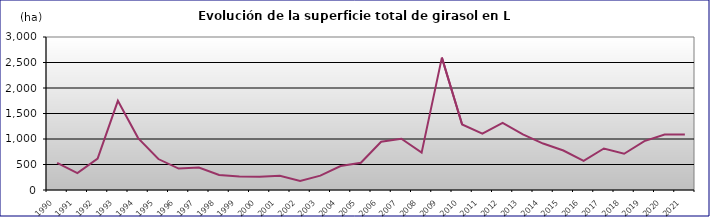
| Category | TOTAL |
|---|---|
| 1990.0 | 532 |
| 1991.0 | 332 |
| 1992.0 | 614 |
| 1993.0 | 1749 |
| 1994.0 | 1018 |
| 1995.0 | 607 |
| 1996.0 | 420 |
| 1997.0 | 440 |
| 1998.0 | 294 |
| 1999.0 | 263 |
| 2000.0 | 260 |
| 2001.0 | 279 |
| 2002.0 | 175 |
| 2003.0 | 282 |
| 2004.0 | 470 |
| 2005.0 | 535 |
| 2006.0 | 946 |
| 2007.0 | 1006 |
| 2008.0 | 732 |
| 2009.0 | 2595 |
| 2010.0 | 1285 |
| 2011.0 | 1105 |
| 2012.0 | 1317 |
| 2013.0 | 1090 |
| 2014.0 | 911 |
| 2015.0 | 774 |
| 2016.0 | 571 |
| 2017.0 | 814 |
| 2018.0 | 711 |
| 2019.0 | 960 |
| 2020.0 | 1088 |
| 2021.0 | 1089 |